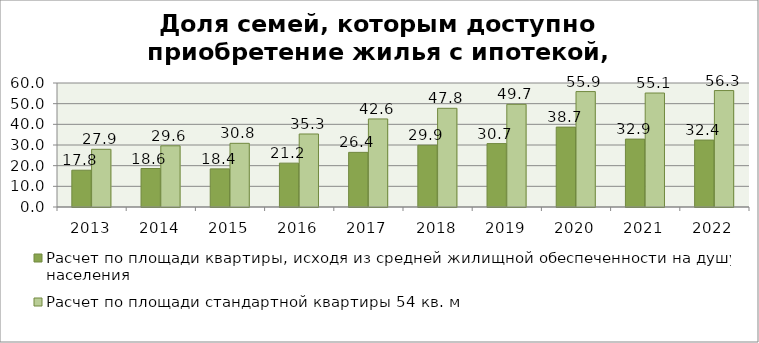
| Category | Расчет по площади квартиры, исходя из средней жилищной обеспеченности на душу населения  | Расчет по площади стандартной квартиры 54 кв. м |
|---|---|---|
| 2013 | 17.803 | 27.916 |
| 2014 | 18.627 | 29.608 |
| 2015 | 18.442 | 30.813 |
| 2016 | 21.225 | 35.327 |
| 2017 | 26.432 | 42.604 |
| 2018 | 29.886 | 47.752 |
| 2019 | 30.684 | 49.681 |
| 2020 | 38.658 | 55.852 |
| 2021 | 32.854 | 55.148 |
| 2022 | 32.387 | 56.343 |